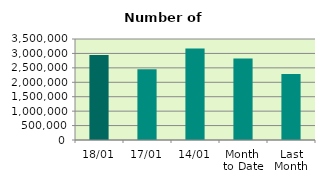
| Category | Series 0 |
|---|---|
| 18/01 | 2943434 |
| 17/01 | 2448718 |
| 14/01 | 3173210 |
| Month 
to Date | 2824627.167 |
| Last
Month | 2284008.087 |